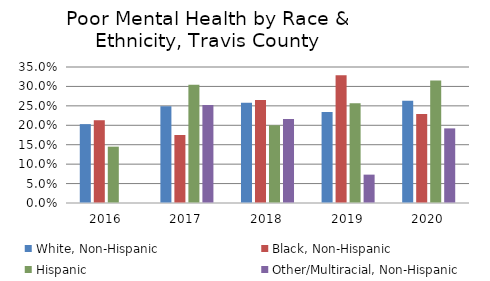
| Category | White, Non-Hispanic | Black, Non-Hispanic | Hispanic | Other/Multiracial, Non-Hispanic |
|---|---|---|---|---|
| 2016.0 | 0.203 | 0.213 | 0.145 | 0 |
| 2017.0 | 0.249 | 0.175 | 0.304 | 0.252 |
| 2018.0 | 0.258 | 0.265 | 0.2 | 0.216 |
| 2019.0 | 0.234 | 0.329 | 0.257 | 0.073 |
| 2020.0 | 0.263 | 0.229 | 0.315 | 0.192 |